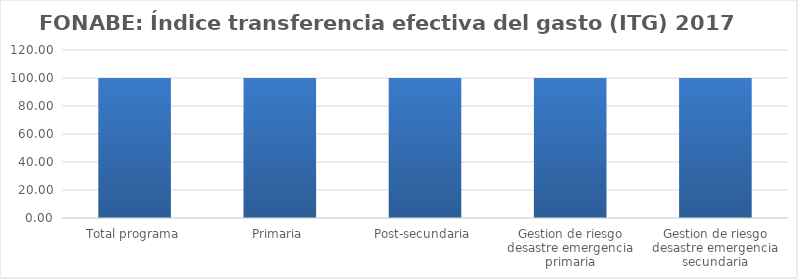
| Category | Índice transferencia efectiva del gasto (ITG) |
|---|---|
| Total programa | 100 |
| Primaria | 100 |
| Post-secundaria  | 100 |
| Gestion de riesgo desastre emergencia primaria | 100 |
| Gestion de riesgo desastre emergencia secundaria | 100 |